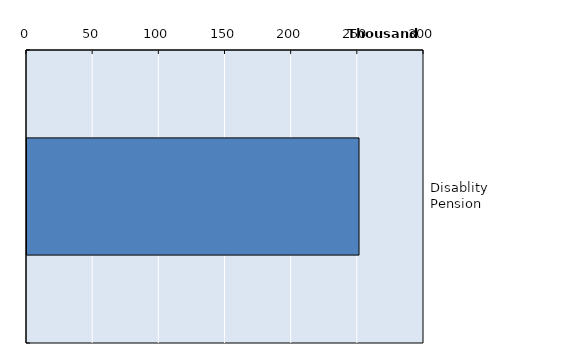
| Category | Series 0 |
|---|---|
| Disablity Pension | 250902 |